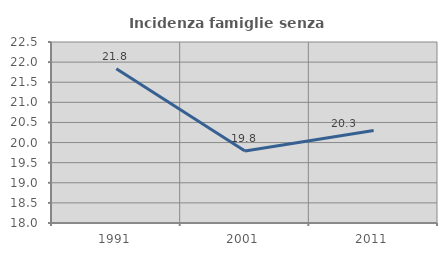
| Category | Incidenza famiglie senza nuclei |
|---|---|
| 1991.0 | 21.833 |
| 2001.0 | 19.79 |
| 2011.0 | 20.301 |